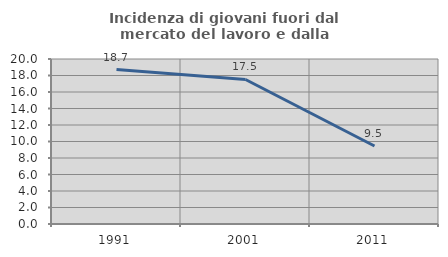
| Category | Incidenza di giovani fuori dal mercato del lavoro e dalla formazione  |
|---|---|
| 1991.0 | 18.719 |
| 2001.0 | 17.518 |
| 2011.0 | 9.451 |